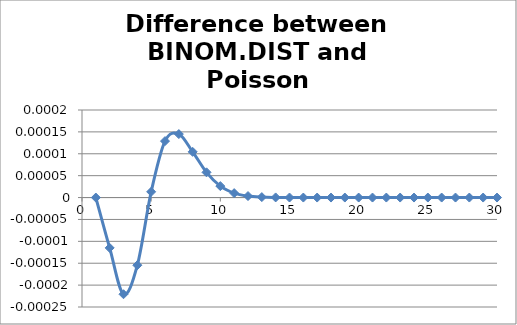
| Category | BINOM.DIST v. Poisson |
|---|---|
| 0 | 0 |
| 1 | 0 |
| 2 | 0 |
| 3 | 0 |
| 4 | 0 |
| 5 | 0 |
| 6 | 0 |
| 7 | 0 |
| 8 | 0 |
| 9 | 0 |
| 10 | 0 |
| 11 | 0 |
| 12 | 0 |
| 13 | 0 |
| 14 | 0 |
| 15 | 0 |
| 16 | 0 |
| 17 | 0 |
| 18 | 0 |
| 19 | 0 |
| 20 | 0 |
| 21 | 0 |
| 22 | 0 |
| 23 | 0 |
| 24 | 0 |
| 25 | 0 |
| 26 | 0 |
| 27 | 0 |
| 28 | 0 |
| 29 | 0 |
| 30 | 0 |
| 31 | 0 |
| 32 | 0 |
| 33 | 0 |
| 34 | 0 |
| 35 | 0 |
| 36 | 0 |
| 37 | 0 |
| 38 | 0 |
| 39 | 0 |
| 40 | 0 |
| 41 | 0 |
| 42 | 0 |
| 43 | 0 |
| 44 | 0 |
| 45 | 0 |
| 46 | 0 |
| 47 | 0 |
| 48 | 0 |
| 49 | 0 |
| 50 | 0 |
| 51 | 0 |
| 52 | 0 |
| 53 | 0 |
| 54 | 0 |
| 55 | 0 |
| 56 | 0 |
| 57 | 0 |
| 58 | 0 |
| 59 | 0 |
| 60 | 0 |
| 61 | 0 |
| 62 | 0 |
| 63 | 0 |
| 64 | 0 |
| 65 | 0 |
| 66 | 0 |
| 67 | 0 |
| 68 | 0 |
| 69 | 0 |
| 70 | 0 |
| 71 | 0 |
| 72 | 0 |
| 73 | 0 |
| 74 | 0 |
| 75 | 0 |
| 76 | 0 |
| 77 | 0 |
| 78 | 0 |
| 79 | 0 |
| 80 | 0 |
| 81 | 0 |
| 82 | 0 |
| 83 | 0 |
| 84 | 0 |
| 85 | 0 |
| 86 | 0 |
| 87 | 0 |
| 88 | 0 |
| 89 | 0 |
| 90 | 0 |
| 91 | 0 |
| 92 | 0 |
| 93 | 0 |
| 94 | 0 |
| 95 | 0 |
| 96 | 0 |
| 97 | 0 |
| 98 | 0 |
| 99 | 0 |
| 100 | 0 |
| 101 | 0 |
| 102 | 0 |
| 103 | 0 |
| 104 | 0 |
| 105 | 0 |
| 106 | 0 |
| 107 | 0 |
| 108 | 0 |
| 109 | 0 |
| 110 | 0 |
| 111 | 0 |
| 112 | 0 |
| 113 | 0 |
| 114 | 0 |
| 115 | 0 |
| 116 | 0 |
| 117 | 0 |
| 118 | 0 |
| 119 | 0 |
| 120 | 0 |
| 121 | 0 |
| 122 | 0 |
| 123 | 0 |
| 124 | 0 |
| 125 | 0 |
| 126 | 0 |
| 127 | 0 |
| 128 | 0 |
| 129 | 0 |
| 130 | 0 |
| 131 | 0 |
| 132 | 0 |
| 133 | 0 |
| 134 | 0 |
| 135 | 0 |
| 136 | 0 |
| 137 | 0 |
| 138 | 0 |
| 139 | 0 |
| 140 | 0 |
| 141 | 0 |
| 142 | 0 |
| 143 | 0 |
| 144 | 0 |
| 145 | 0 |
| 146 | 0 |
| 147 | 0 |
| 148 | 0 |
| 149 | 0 |
| 150 | 0 |
| 151 | 0 |
| 152 | 0 |
| 153 | 0 |
| 154 | 0 |
| 155 | 0 |
| 156 | 0 |
| 157 | 0 |
| 158 | 0 |
| 159 | 0 |
| 160 | 0 |
| 161 | 0 |
| 162 | 0 |
| 163 | 0 |
| 164 | 0 |
| 165 | 0 |
| 166 | 0 |
| 167 | 0 |
| 168 | 0 |
| 169 | 0 |
| 170 | 0 |
| 171 | 0 |
| 172 | 0 |
| 173 | 0 |
| 174 | 0 |
| 175 | 0 |
| 176 | 0 |
| 177 | 0 |
| 178 | 0 |
| 179 | 0 |
| 180 | 0 |
| 181 | 0 |
| 182 | 0 |
| 183 | 0 |
| 184 | 0 |
| 185 | 0 |
| 186 | 0 |
| 187 | 0 |
| 188 | 0 |
| 189 | 0 |
| 190 | 0 |
| 191 | 0 |
| 192 | 0 |
| 193 | 0 |
| 194 | 0 |
| 195 | 0 |
| 196 | 0 |
| 197 | 0 |
| 198 | 0 |
| 199 | 0 |
| 200 | 0 |
| 201 | 0 |
| 202 | 0 |
| 203 | 0 |
| 204 | 0 |
| 205 | 0 |
| 206 | 0 |
| 207 | 0 |
| 208 | 0 |
| 209 | 0 |
| 210 | 0 |
| 211 | 0 |
| 212 | 0 |
| 213 | 0 |
| 214 | 0 |
| 215 | 0 |
| 216 | 0 |
| 217 | 0 |
| 218 | 0 |
| 219 | 0 |
| 220 | 0 |
| 221 | 0 |
| 222 | 0 |
| 223 | 0 |
| 224 | 0 |
| 225 | 0 |
| 226 | 0 |
| 227 | 0 |
| 228 | 0 |
| 229 | 0 |
| 230 | 0 |
| 231 | 0 |
| 232 | 0 |
| 233 | 0 |
| 234 | 0 |
| 235 | 0 |
| 236 | 0 |
| 237 | 0 |
| 238 | 0 |
| 239 | 0 |
| 240 | 0 |
| 241 | 0 |
| 242 | 0 |
| 243 | 0 |
| 244 | 0 |
| 245 | 0 |
| 246 | 0 |
| 247 | 0 |
| 248 | 0 |
| 249 | 0 |
| 250 | 0 |
| 251 | 0 |
| 252 | 0 |
| 253 | 0 |
| 254 | 0 |
| 255 | 0 |
| 256 | 0 |
| 257 | 0 |
| 258 | 0 |
| 259 | 0 |
| 260 | 0 |
| 261 | 0 |
| 262 | 0 |
| 263 | 0 |
| 264 | 0 |
| 265 | 0 |
| 266 | 0 |
| 267 | 0 |
| 268 | 0 |
| 269 | 0 |
| 270 | 0 |
| 271 | 0 |
| 272 | 0 |
| 273 | 0 |
| 274 | 0 |
| 275 | 0 |
| 276 | 0 |
| 277 | 0 |
| 278 | 0 |
| 279 | 0 |
| 280 | 0 |
| 281 | 0 |
| 282 | 0 |
| 283 | 0 |
| 284 | 0 |
| 285 | 0 |
| 286 | 0 |
| 287 | 0 |
| 288 | 0 |
| 289 | 0 |
| 290 | 0 |
| 291 | 0 |
| 292 | 0 |
| 293 | 0 |
| 294 | 0 |
| 295 | 0 |
| 296 | 0 |
| 297 | 0 |
| 298 | 0 |
| 299 | 0 |
| 300 | 0 |
| 301 | 0 |
| 302 | 0 |
| 303 | 0 |
| 304 | 0 |
| 305 | 0 |
| 306 | 0 |
| 307 | 0 |
| 308 | 0 |
| 309 | 0 |
| 310 | 0 |
| 311 | 0 |
| 312 | 0 |
| 313 | 0 |
| 314 | 0 |
| 315 | 0 |
| 316 | 0 |
| 317 | 0 |
| 318 | 0 |
| 319 | 0 |
| 320 | 0 |
| 321 | 0 |
| 322 | 0 |
| 323 | 0 |
| 324 | 0 |
| 325 | 0 |
| 326 | 0 |
| 327 | 0 |
| 328 | 0 |
| 329 | 0 |
| 330 | 0 |
| 331 | 0 |
| 332 | 0 |
| 333 | 0 |
| 334 | 0 |
| 335 | 0 |
| 336 | 0 |
| 337 | 0 |
| 338 | 0 |
| 339 | 0 |
| 340 | 0 |
| 341 | 0 |
| 342 | 0 |
| 343 | 0 |
| 344 | 0 |
| 345 | 0 |
| 346 | 0 |
| 347 | 0 |
| 348 | 0 |
| 349 | 0 |
| 350 | 0 |
| 351 | 0 |
| 352 | 0 |
| 353 | 0 |
| 354 | 0 |
| 355 | 0 |
| 356 | 0 |
| 357 | 0 |
| 358 | 0 |
| 359 | 0 |
| 360 | 0 |
| 361 | 0 |
| 362 | 0 |
| 363 | 0 |
| 364 | 0 |
| 365 | 0 |
| 366 | 0 |
| 367 | 0 |
| 368 | 0 |
| 369 | 0 |
| 370 | 0 |
| 371 | 0 |
| 372 | 0 |
| 373 | 0 |
| 374 | 0 |
| 375 | 0 |
| 376 | 0 |
| 377 | 0 |
| 378 | 0 |
| 379 | 0 |
| 380 | 0 |
| 381 | 0 |
| 382 | 0 |
| 383 | 0 |
| 384 | 0 |
| 385 | 0 |
| 386 | 0 |
| 387 | 0 |
| 388 | 0 |
| 389 | 0 |
| 390 | 0 |
| 391 | 0 |
| 392 | 0 |
| 393 | 0 |
| 394 | 0 |
| 395 | 0 |
| 396 | 0 |
| 397 | 0 |
| 398 | 0 |
| 399 | 0 |
| 400 | 0 |
| 401 | 0 |
| 402 | 0 |
| 403 | 0 |
| 404 | 0 |
| 405 | 0 |
| 406 | 0 |
| 407 | 0 |
| 408 | 0 |
| 409 | 0 |
| 410 | 0 |
| 411 | 0 |
| 412 | 0 |
| 413 | 0 |
| 414 | 0 |
| 415 | 0 |
| 416 | 0 |
| 417 | 0 |
| 418 | 0 |
| 419 | 0 |
| 420 | 0 |
| 421 | 0 |
| 422 | 0 |
| 423 | 0 |
| 424 | 0 |
| 425 | 0 |
| 426 | 0 |
| 427 | 0 |
| 428 | 0 |
| 429 | 0 |
| 430 | 0 |
| 431 | 0 |
| 432 | 0 |
| 433 | 0 |
| 434 | 0 |
| 435 | 0 |
| 436 | 0 |
| 437 | 0 |
| 438 | 0 |
| 439 | 0 |
| 440 | 0 |
| 441 | 0 |
| 442 | 0 |
| 443 | 0 |
| 444 | 0 |
| 445 | 0 |
| 446 | 0 |
| 447 | 0 |
| 448 | 0 |
| 449 | 0 |
| 450 | 0 |
| 451 | 0 |
| 452 | 0 |
| 453 | 0 |
| 454 | 0 |
| 455 | 0 |
| 456 | 0 |
| 457 | 0 |
| 458 | 0 |
| 459 | 0 |
| 460 | 0 |
| 461 | 0 |
| 462 | 0 |
| 463 | 0 |
| 464 | 0 |
| 465 | 0 |
| 466 | 0 |
| 467 | 0 |
| 468 | 0 |
| 469 | 0 |
| 470 | 0 |
| 471 | 0 |
| 472 | 0 |
| 473 | 0 |
| 474 | 0 |
| 475 | 0 |
| 476 | 0 |
| 477 | 0 |
| 478 | 0 |
| 479 | 0 |
| 480 | 0 |
| 481 | 0 |
| 482 | 0 |
| 483 | 0 |
| 484 | 0 |
| 485 | 0 |
| 486 | 0 |
| 487 | 0 |
| 488 | 0 |
| 489 | 0 |
| 490 | 0 |
| 491 | 0 |
| 492 | 0 |
| 493 | 0 |
| 494 | 0 |
| 495 | 0 |
| 496 | 0 |
| 497 | 0 |
| 498 | 0 |
| 499 | 0 |
| 500 | 0 |
| 501 | 0 |
| 502 | 0 |
| 503 | 0 |
| 504 | 0 |
| 505 | 0 |
| 506 | 0 |
| 507 | 0 |
| 508 | 0 |
| 509 | 0 |
| 510 | 0 |
| 511 | 0 |
| 512 | 0 |
| 513 | 0 |
| 514 | 0 |
| 515 | 0 |
| 516 | 0 |
| 517 | 0 |
| 518 | 0 |
| 519 | 0 |
| 520 | 0 |
| 521 | 0 |
| 522 | 0 |
| 523 | 0 |
| 524 | 0 |
| 525 | 0 |
| 526 | 0 |
| 527 | 0 |
| 528 | 0 |
| 529 | 0 |
| 530 | 0 |
| 531 | 0 |
| 532 | 0 |
| 533 | 0 |
| 534 | 0 |
| 535 | 0 |
| 536 | 0 |
| 537 | 0 |
| 538 | 0 |
| 539 | 0 |
| 540 | 0 |
| 541 | 0 |
| 542 | 0 |
| 543 | 0 |
| 544 | 0 |
| 545 | 0 |
| 546 | 0 |
| 547 | 0 |
| 548 | 0 |
| 549 | 0 |
| 550 | 0 |
| 551 | 0 |
| 552 | 0 |
| 553 | 0 |
| 554 | 0 |
| 555 | 0 |
| 556 | 0 |
| 557 | 0 |
| 558 | 0 |
| 559 | 0 |
| 560 | 0 |
| 561 | 0 |
| 562 | 0 |
| 563 | 0 |
| 564 | 0 |
| 565 | 0 |
| 566 | 0 |
| 567 | 0 |
| 568 | 0 |
| 569 | 0 |
| 570 | 0 |
| 571 | 0 |
| 572 | 0 |
| 573 | 0 |
| 574 | 0 |
| 575 | 0 |
| 576 | 0 |
| 577 | 0 |
| 578 | 0 |
| 579 | 0 |
| 580 | 0 |
| 581 | 0 |
| 582 | 0 |
| 583 | 0 |
| 584 | 0 |
| 585 | 0 |
| 586 | 0 |
| 587 | 0 |
| 588 | 0 |
| 589 | 0 |
| 590 | 0 |
| 591 | 0 |
| 592 | 0 |
| 593 | 0 |
| 594 | 0 |
| 595 | 0 |
| 596 | 0 |
| 597 | 0 |
| 598 | 0 |
| 599 | 0 |
| 600 | 0 |
| 601 | 0 |
| 602 | 0 |
| 603 | 0 |
| 604 | 0 |
| 605 | 0 |
| 606 | 0 |
| 607 | 0 |
| 608 | 0 |
| 609 | 0 |
| 610 | 0 |
| 611 | 0 |
| 612 | 0 |
| 613 | 0 |
| 614 | 0 |
| 615 | 0 |
| 616 | 0 |
| 617 | 0 |
| 618 | 0 |
| 619 | 0 |
| 620 | 0 |
| 621 | 0 |
| 622 | 0 |
| 623 | 0 |
| 624 | 0 |
| 625 | 0 |
| 626 | 0 |
| 627 | 0 |
| 628 | 0 |
| 629 | 0 |
| 630 | 0 |
| 631 | 0 |
| 632 | 0 |
| 633 | 0 |
| 634 | 0 |
| 635 | 0 |
| 636 | 0 |
| 637 | 0 |
| 638 | 0 |
| 639 | 0 |
| 640 | 0 |
| 641 | 0 |
| 642 | 0 |
| 643 | 0 |
| 644 | 0 |
| 645 | 0 |
| 646 | 0 |
| 647 | 0 |
| 648 | 0 |
| 649 | 0 |
| 650 | 0 |
| 651 | 0 |
| 652 | 0 |
| 653 | 0 |
| 654 | 0 |
| 655 | 0 |
| 656 | 0 |
| 657 | 0 |
| 658 | 0 |
| 659 | 0 |
| 660 | 0 |
| 661 | 0 |
| 662 | 0 |
| 663 | 0 |
| 664 | 0 |
| 665 | 0 |
| 666 | 0 |
| 667 | 0 |
| 668 | 0 |
| 669 | 0 |
| 670 | 0 |
| 671 | 0 |
| 672 | 0 |
| 673 | 0 |
| 674 | 0 |
| 675 | 0 |
| 676 | 0 |
| 677 | 0 |
| 678 | 0 |
| 679 | 0 |
| 680 | 0 |
| 681 | 0 |
| 682 | 0 |
| 683 | 0 |
| 684 | 0 |
| 685 | 0 |
| 686 | 0 |
| 687 | 0 |
| 688 | 0 |
| 689 | 0 |
| 690 | 0 |
| 691 | 0 |
| 692 | 0 |
| 693 | 0 |
| 694 | 0 |
| 695 | 0 |
| 696 | 0 |
| 697 | 0 |
| 698 | 0 |
| 699 | 0 |
| 700 | 0 |
| 701 | 0 |
| 702 | 0 |
| 703 | 0 |
| 704 | 0 |
| 705 | 0 |
| 706 | 0 |
| 707 | 0 |
| 708 | 0 |
| 709 | 0 |
| 710 | 0 |
| 711 | 0 |
| 712 | 0 |
| 713 | 0 |
| 714 | 0 |
| 715 | 0 |
| 716 | 0 |
| 717 | 0 |
| 718 | 0 |
| 719 | 0 |
| 720 | 0 |
| 721 | 0 |
| 722 | 0 |
| 723 | 0 |
| 724 | 0 |
| 725 | 0 |
| 726 | 0 |
| 727 | 0 |
| 728 | 0 |
| 729 | 0 |
| 730 | 0 |
| 731 | 0 |
| 732 | 0 |
| 733 | 0 |
| 734 | 0 |
| 735 | 0 |
| 736 | 0 |
| 737 | 0 |
| 738 | 0 |
| 739 | 0 |
| 740 | 0 |
| 741 | 0 |
| 742 | 0 |
| 743 | 0 |
| 744 | 0 |
| 745 | 0 |
| 746 | 0 |
| 747 | 0 |
| 748 | 0 |
| 749 | 0 |
| 750 | 0 |
| 751 | 0 |
| 752 | 0 |
| 753 | 0 |
| 754 | 0 |
| 755 | 0 |
| 756 | 0 |
| 757 | 0 |
| 758 | 0 |
| 759 | 0 |
| 760 | 0 |
| 761 | 0 |
| 762 | 0 |
| 763 | 0 |
| 764 | 0 |
| 765 | 0 |
| 766 | 0 |
| 767 | 0 |
| 768 | 0 |
| 769 | 0 |
| 770 | 0 |
| 771 | 0 |
| 772 | 0 |
| 773 | 0 |
| 774 | 0 |
| 775 | 0 |
| 776 | 0 |
| 777 | 0 |
| 778 | 0 |
| 779 | 0 |
| 780 | 0 |
| 781 | 0 |
| 782 | 0 |
| 783 | 0 |
| 784 | 0 |
| 785 | 0 |
| 786 | 0 |
| 787 | 0 |
| 788 | 0 |
| 789 | 0 |
| 790 | 0 |
| 791 | 0 |
| 792 | 0 |
| 793 | 0 |
| 794 | 0 |
| 795 | 0 |
| 796 | 0 |
| 797 | 0 |
| 798 | 0 |
| 799 | 0 |
| 800 | 0 |
| 801 | 0 |
| 802 | 0 |
| 803 | 0 |
| 804 | 0 |
| 805 | 0 |
| 806 | 0 |
| 807 | 0 |
| 808 | 0 |
| 809 | 0 |
| 810 | 0 |
| 811 | 0 |
| 812 | 0 |
| 813 | 0 |
| 814 | 0 |
| 815 | 0 |
| 816 | 0 |
| 817 | 0 |
| 818 | 0 |
| 819 | 0 |
| 820 | 0 |
| 821 | 0 |
| 822 | 0 |
| 823 | 0 |
| 824 | 0 |
| 825 | 0 |
| 826 | 0 |
| 827 | 0 |
| 828 | 0 |
| 829 | 0 |
| 830 | 0 |
| 831 | 0 |
| 832 | 0 |
| 833 | 0 |
| 834 | 0 |
| 835 | 0 |
| 836 | 0 |
| 837 | 0 |
| 838 | 0 |
| 839 | 0 |
| 840 | 0 |
| 841 | 0 |
| 842 | 0 |
| 843 | 0 |
| 844 | 0 |
| 845 | 0 |
| 846 | 0 |
| 847 | 0 |
| 848 | 0 |
| 849 | 0 |
| 850 | 0 |
| 851 | 0 |
| 852 | 0 |
| 853 | 0 |
| 854 | 0 |
| 855 | 0 |
| 856 | 0 |
| 857 | 0 |
| 858 | 0 |
| 859 | 0 |
| 860 | 0 |
| 861 | 0 |
| 862 | 0 |
| 863 | 0 |
| 864 | 0 |
| 865 | 0 |
| 866 | 0 |
| 867 | 0 |
| 868 | 0 |
| 869 | 0 |
| 870 | 0 |
| 871 | 0 |
| 872 | 0 |
| 873 | 0 |
| 874 | 0 |
| 875 | 0 |
| 876 | 0 |
| 877 | 0 |
| 878 | 0 |
| 879 | 0 |
| 880 | 0 |
| 881 | 0 |
| 882 | 0 |
| 883 | 0 |
| 884 | 0 |
| 885 | 0 |
| 886 | 0 |
| 887 | 0 |
| 888 | 0 |
| 889 | 0 |
| 890 | 0 |
| 891 | 0 |
| 892 | 0 |
| 893 | 0 |
| 894 | 0 |
| 895 | 0 |
| 896 | 0 |
| 897 | 0 |
| 898 | 0 |
| 899 | 0 |
| 900 | 0 |
| 901 | 0 |
| 902 | 0 |
| 903 | 0 |
| 904 | 0 |
| 905 | 0 |
| 906 | 0 |
| 907 | 0 |
| 908 | 0 |
| 909 | 0 |
| 910 | 0 |
| 911 | 0 |
| 912 | 0 |
| 913 | 0 |
| 914 | 0 |
| 915 | 0 |
| 916 | 0 |
| 917 | 0 |
| 918 | 0 |
| 919 | 0 |
| 920 | 0 |
| 921 | 0 |
| 922 | 0 |
| 923 | 0 |
| 924 | 0 |
| 925 | 0 |
| 926 | 0 |
| 927 | 0 |
| 928 | 0 |
| 929 | 0 |
| 930 | 0 |
| 931 | 0 |
| 932 | 0 |
| 933 | 0 |
| 934 | 0 |
| 935 | 0 |
| 936 | 0 |
| 937 | 0 |
| 938 | 0 |
| 939 | 0 |
| 940 | 0 |
| 941 | 0 |
| 942 | 0 |
| 943 | 0 |
| 944 | 0 |
| 945 | 0 |
| 946 | 0 |
| 947 | 0 |
| 948 | 0 |
| 949 | 0 |
| 950 | 0 |
| 951 | 0 |
| 952 | 0 |
| 953 | 0 |
| 954 | 0 |
| 955 | 0 |
| 956 | 0 |
| 957 | 0 |
| 958 | 0 |
| 959 | 0 |
| 960 | 0 |
| 961 | 0 |
| 962 | 0 |
| 963 | 0 |
| 964 | 0 |
| 965 | 0 |
| 966 | 0 |
| 967 | 0 |
| 968 | 0 |
| 969 | 0 |
| 970 | 0 |
| 971 | 0 |
| 972 | 0 |
| 973 | 0 |
| 974 | 0 |
| 975 | 0 |
| 976 | 0 |
| 977 | 0 |
| 978 | 0 |
| 979 | 0 |
| 980 | 0 |
| 981 | 0 |
| 982 | 0 |
| 983 | 0 |
| 984 | 0 |
| 985 | 0 |
| 986 | 0 |
| 987 | 0 |
| 988 | 0 |
| 989 | 0 |
| 990 | 0 |
| 991 | 0 |
| 992 | 0 |
| 993 | 0 |
| 994 | 0 |
| 995 | 0 |
| 996 | 0 |
| 997 | 0 |
| 998 | 0 |
| 999 | 0 |
| 1000 | 0 |
| 1001 | 0 |
| 1002 | 0 |
| 1003 | 0 |
| 1004 | 0 |
| 1005 | 0 |
| 1006 | 0 |
| 1007 | 0 |
| 1008 | 0 |
| 1009 | 0 |
| 1010 | 0 |
| 1011 | 0 |
| 1012 | 0 |
| 1013 | 0 |
| 1014 | 0 |
| 1015 | 0 |
| 1016 | 0 |
| 1017 | 0 |
| 1018 | 0 |
| 1019 | 0 |
| 1020 | 0 |
| 1021 | 0 |
| 1022 | 0 |
| 1023 | 0 |
| 1024 | 0 |
| 1025 | 0 |
| 1026 | 0 |
| 1027 | 0 |
| 1028 | 0 |
| 1029 | 0 |
| 1030 | 0 |
| 1031 | 0 |
| 1032 | 0 |
| 1033 | 0 |
| 1034 | 0 |
| 1035 | 0 |
| 1036 | 0 |
| 1037 | 0 |
| 1038 | 0 |
| 1039 | 0 |
| 1040 | 0 |
| 1041 | 0 |
| 1042 | 0 |
| 1043 | 0 |
| 1044 | 0 |
| 1045 | 0 |
| 1046 | 0 |
| 1047 | 0 |
| 1048 | 0 |
| 1049 | 0 |
| 1050 | 0 |
| 1051 | 0 |
| 1052 | 0 |
| 1053 | 0 |
| 1054 | 0 |
| 1055 | 0 |
| 1056 | 0 |
| 1057 | 0 |
| 1058 | 0 |
| 1059 | 0 |
| 1060 | 0 |
| 1061 | 0 |
| 1062 | 0 |
| 1063 | 0 |
| 1064 | 0 |
| 1065 | 0 |
| 1066 | 0 |
| 1067 | 0 |
| 1068 | 0 |
| 1069 | 0 |
| 1070 | 0 |
| 1071 | 0 |
| 1072 | 0 |
| 1073 | 0 |
| 1074 | 0 |
| 1075 | 0 |
| 1076 | 0 |
| 1077 | 0 |
| 1078 | 0 |
| 1079 | 0 |
| 1080 | 0 |
| 1081 | 0 |
| 1082 | 0 |
| 1083 | 0 |
| 1084 | 0 |
| 1085 | 0 |
| 1086 | 0 |
| 1087 | 0 |
| 1088 | 0 |
| 1089 | 0 |
| 1090 | 0 |
| 1091 | 0 |
| 1092 | 0 |
| 1093 | 0 |
| 1094 | 0 |
| 1095 | 0 |
| 1096 | 0 |
| 1097 | 0 |
| 1098 | 0 |
| 1099 | 0 |
| 1100 | 0 |
| 1101 | 0 |
| 1102 | 0 |
| 1103 | 0 |
| 1104 | 0 |
| 1105 | 0 |
| 1106 | 0 |
| 1107 | 0 |
| 1108 | 0 |
| 1109 | 0 |
| 1110 | 0 |
| 1111 | 0 |
| 1112 | 0 |
| 1113 | 0 |
| 1114 | 0 |
| 1115 | 0 |
| 1116 | 0 |
| 1117 | 0 |
| 1118 | 0 |
| 1119 | 0 |
| 1120 | 0 |
| 1121 | 0 |
| 1122 | 0 |
| 1123 | 0 |
| 1124 | 0 |
| 1125 | 0 |
| 1126 | 0 |
| 1127 | 0 |
| 1128 | 0 |
| 1129 | 0 |
| 1130 | 0 |
| 1131 | 0 |
| 1132 | 0 |
| 1133 | 0 |
| 1134 | 0 |
| 1135 | 0 |
| 1136 | 0 |
| 1137 | 0 |
| 1138 | 0 |
| 1139 | 0 |
| 1140 | 0 |
| 1141 | 0 |
| 1142 | 0 |
| 1143 | 0 |
| 1144 | 0 |
| 1145 | 0 |
| 1146 | 0 |
| 1147 | 0 |
| 1148 | 0 |
| 1149 | 0 |
| 1150 | 0 |
| 1151 | 0 |
| 1152 | 0 |
| 1153 | 0 |
| 1154 | 0 |
| 1155 | 0 |
| 1156 | 0 |
| 1157 | 0 |
| 1158 | 0 |
| 1159 | 0 |
| 1160 | 0 |
| 1161 | 0 |
| 1162 | 0 |
| 1163 | 0 |
| 1164 | 0 |
| 1165 | 0 |
| 1166 | 0 |
| 1167 | 0 |
| 1168 | 0 |
| 1169 | 0 |
| 1170 | 0 |
| 1171 | 0 |
| 1172 | 0 |
| 1173 | 0 |
| 1174 | 0 |
| 1175 | 0 |
| 1176 | 0 |
| 1177 | 0 |
| 1178 | 0 |
| 1179 | 0 |
| 1180 | 0 |
| 1181 | 0 |
| 1182 | 0 |
| 1183 | 0 |
| 1184 | 0 |
| 1185 | 0 |
| 1186 | 0 |
| 1187 | 0 |
| 1188 | 0 |
| 1189 | 0 |
| 1190 | 0 |
| 1191 | 0 |
| 1192 | 0 |
| 1193 | 0 |
| 1194 | 0 |
| 1195 | 0 |
| 1196 | 0 |
| 1197 | 0 |
| 1198 | 0 |
| 1199 | 0 |
| 1200 | 0 |
| 1201 | 0 |
| 1202 | 0 |
| 1203 | 0 |
| 1204 | 0 |
| 1205 | 0 |
| 1206 | 0 |
| 1207 | 0 |
| 1208 | 0 |
| 1209 | 0 |
| 1210 | 0 |
| 1211 | 0 |
| 1212 | 0 |
| 1213 | 0 |
| 1214 | 0 |
| 1215 | 0 |
| 1216 | 0 |
| 1217 | 0 |
| 1218 | 0 |
| 1219 | 0 |
| 1220 | 0 |
| 1221 | 0 |
| 1222 | 0 |
| 1223 | 0 |
| 1224 | 0 |
| 1225 | 0 |
| 1226 | 0 |
| 1227 | 0 |
| 1228 | 0 |
| 1229 | 0 |
| 1230 | 0 |
| 1231 | 0 |
| 1232 | 0 |
| 1233 | 0 |
| 1234 | 0 |
| 1235 | 0 |
| 1236 | 0 |
| 1237 | 0 |
| 1238 | 0 |
| 1239 | 0 |
| 1240 | 0 |
| 1241 | 0 |
| 1242 | 0 |
| 1243 | 0 |
| 1244 | 0 |
| 1245 | 0 |
| 1246 | 0 |
| 1247 | 0 |
| 1248 | 0 |
| 1249 | 0 |
| 1250 | 0 |
| 1251 | 0 |
| 1252 | 0 |
| 1253 | 0 |
| 1254 | 0 |
| 1255 | 0 |
| 1256 | 0 |
| 1257 | 0 |
| 1258 | 0 |
| 1259 | 0 |
| 1260 | 0 |
| 1261 | 0 |
| 1262 | 0 |
| 1263 | 0 |
| 1264 | 0 |
| 1265 | 0 |
| 1266 | 0 |
| 1267 | 0 |
| 1268 | 0 |
| 1269 | 0 |
| 1270 | 0 |
| 1271 | 0 |
| 1272 | 0 |
| 1273 | 0 |
| 1274 | 0 |
| 1275 | 0 |
| 1276 | 0 |
| 1277 | 0 |
| 1278 | 0 |
| 1279 | 0 |
| 1280 | 0 |
| 1281 | 0 |
| 1282 | 0 |
| 1283 | 0 |
| 1284 | 0 |
| 1285 | 0 |
| 1286 | 0 |
| 1287 | 0 |
| 1288 | 0 |
| 1289 | 0 |
| 1290 | 0 |
| 1291 | 0 |
| 1292 | 0 |
| 1293 | 0 |
| 1294 | 0 |
| 1295 | 0 |
| 1296 | 0 |
| 1297 | 0 |
| 1298 | 0 |
| 1299 | 0 |
| 1300 | 0 |
| 1301 | 0 |
| 1302 | 0 |
| 1303 | 0 |
| 1304 | 0 |
| 1305 | 0 |
| 1306 | 0 |
| 1307 | 0 |
| 1308 | 0 |
| 1309 | 0 |
| 1310 | 0 |
| 1311 | 0 |
| 1312 | 0 |
| 1313 | 0 |
| 1314 | 0 |
| 1315 | 0 |
| 1316 | 0 |
| 1317 | 0 |
| 1318 | 0 |
| 1319 | 0 |
| 1320 | 0 |
| 1321 | 0 |
| 1322 | 0 |
| 1323 | 0 |
| 1324 | 0 |
| 1325 | 0 |
| 1326 | 0 |
| 1327 | 0 |
| 1328 | 0 |
| 1329 | 0 |
| 1330 | 0 |
| 1331 | 0 |
| 1332 | 0 |
| 1333 | 0 |
| 1334 | 0 |
| 1335 | 0 |
| 1336 | 0 |
| 1337 | 0 |
| 1338 | 0 |
| 1339 | 0 |
| 1340 | 0 |
| 1341 | 0 |
| 1342 | 0 |
| 1343 | 0 |
| 1344 | 0 |
| 1345 | 0 |
| 1346 | 0 |
| 1347 | 0 |
| 1348 | 0 |
| 1349 | 0 |
| 1350 | 0 |
| 1351 | 0 |
| 1352 | 0 |
| 1353 | 0 |
| 1354 | 0 |
| 1355 | 0 |
| 1356 | 0 |
| 1357 | 0 |
| 1358 | 0 |
| 1359 | 0 |
| 1360 | 0 |
| 1361 | 0 |
| 1362 | 0 |
| 1363 | 0 |
| 1364 | 0 |
| 1365 | 0 |
| 1366 | 0 |
| 1367 | 0 |
| 1368 | 0 |
| 1369 | 0 |
| 1370 | 0 |
| 1371 | 0 |
| 1372 | 0 |
| 1373 | 0 |
| 1374 | 0 |
| 1375 | 0 |
| 1376 | 0 |
| 1377 | 0 |
| 1378 | 0 |
| 1379 | 0 |
| 1380 | 0 |
| 1381 | 0 |
| 1382 | 0 |
| 1383 | 0 |
| 1384 | 0 |
| 1385 | 0 |
| 1386 | 0 |
| 1387 | 0 |
| 1388 | 0 |
| 1389 | 0 |
| 1390 | 0 |
| 1391 | 0 |
| 1392 | 0 |
| 1393 | 0 |
| 1394 | 0 |
| 1395 | 0 |
| 1396 | 0 |
| 1397 | 0 |
| 1398 | 0 |
| 1399 | 0 |
| 1400 | 0 |
| 1401 | 0 |
| 1402 | 0 |
| 1403 | 0 |
| 1404 | 0 |
| 1405 | 0 |
| 1406 | 0 |
| 1407 | 0 |
| 1408 | 0 |
| 1409 | 0 |
| 1410 | 0 |
| 1411 | 0 |
| 1412 | 0 |
| 1413 | 0 |
| 1414 | 0 |
| 1415 | 0 |
| 1416 | 0 |
| 1417 | 0 |
| 1418 | 0 |
| 1419 | 0 |
| 1420 | 0 |
| 1421 | 0 |
| 1422 | 0 |
| 1423 | 0 |
| 1424 | 0 |
| 1425 | 0 |
| 1426 | 0 |
| 1427 | 0 |
| 1428 | 0 |
| 1429 | 0 |
| 1430 | 0 |
| 1431 | 0 |
| 1432 | 0 |
| 1433 | 0 |
| 1434 | 0 |
| 1435 | 0 |
| 1436 | 0 |
| 1437 | 0 |
| 1438 | 0 |
| 1439 | 0 |
| 1440 | 0 |
| 1441 | 0 |
| 1442 | 0 |
| 1443 | 0 |
| 1444 | 0 |
| 1445 | 0 |
| 1446 | 0 |
| 1447 | 0 |
| 1448 | 0 |
| 1449 | 0 |
| 1450 | 0 |
| 1451 | 0 |
| 1452 | 0 |
| 1453 | 0 |
| 1454 | 0 |
| 1455 | 0 |
| 1456 | 0 |
| 1457 | 0 |
| 1458 | 0 |
| 1459 | 0 |
| 1460 | 0 |
| 1461 | 0 |
| 1462 | 0 |
| 1463 | 0 |
| 1464 | 0 |
| 1465 | 0 |
| 1466 | 0 |
| 1467 | 0 |
| 1468 | 0 |
| 1469 | 0 |
| 1470 | 0 |
| 1471 | 0 |
| 1472 | 0 |
| 1473 | 0 |
| 1474 | 0 |
| 1475 | 0 |
| 1476 | 0 |
| 1477 | 0 |
| 1478 | 0 |
| 1479 | 0 |
| 1480 | 0 |
| 1481 | 0 |
| 1482 | 0 |
| 1483 | 0 |
| 1484 | 0 |
| 1485 | 0 |
| 1486 | 0 |
| 1487 | 0 |
| 1488 | 0 |
| 1489 | 0 |
| 1490 | 0 |
| 1491 | 0 |
| 1492 | 0 |
| 1493 | 0 |
| 1494 | 0 |
| 1495 | 0 |
| 1496 | 0 |
| 1497 | 0 |
| 1498 | 0 |
| 1499 | 0 |
| 1500 | 0 |
| 1501 | 0 |
| 1502 | 0 |
| 1503 | 0 |
| 1504 | 0 |
| 1505 | 0 |
| 1506 | 0 |
| 1507 | 0 |
| 1508 | 0 |
| 1509 | 0 |
| 1510 | 0 |
| 1511 | 0 |
| 1512 | 0 |
| 1513 | 0 |
| 1514 | 0 |
| 1515 | 0 |
| 1516 | 0 |
| 1517 | 0 |
| 1518 | 0 |
| 1519 | 0 |
| 1520 | 0 |
| 1521 | 0 |
| 1522 | 0 |
| 1523 | 0 |
| 1524 | 0 |
| 1525 | 0 |
| 1526 | 0 |
| 1527 | 0 |
| 1528 | 0 |
| 1529 | 0 |
| 1530 | 0 |
| 1531 | 0 |
| 1532 | 0 |
| 1533 | 0 |
| 1534 | 0 |
| 1535 | 0 |
| 1536 | 0 |
| 1537 | 0 |
| 1538 | 0 |
| 1539 | 0 |
| 1540 | 0 |
| 1541 | 0 |
| 1542 | 0 |
| 1543 | 0 |
| 1544 | 0 |
| 1545 | 0 |
| 1546 | 0 |
| 1547 | 0 |
| 1548 | 0 |
| 1549 | 0 |
| 1550 | 0 |
| 1551 | 0 |
| 1552 | 0 |
| 1553 | 0 |
| 1554 | 0 |
| 1555 | 0 |
| 1556 | 0 |
| 1557 | 0 |
| 1558 | 0 |
| 1559 | 0 |
| 1560 | 0 |
| 1561 | 0 |
| 1562 | 0 |
| 1563 | 0 |
| 1564 | 0 |
| 1565 | 0 |
| 1566 | 0 |
| 1567 | 0 |
| 1568 | 0 |
| 1569 | 0 |
| 1570 | 0 |
| 1571 | 0 |
| 1572 | 0 |
| 1573 | 0 |
| 1574 | 0 |
| 1575 | 0 |
| 1576 | 0 |
| 1577 | 0 |
| 1578 | 0 |
| 1579 | 0 |
| 1580 | 0 |
| 1581 | 0 |
| 1582 | 0 |
| 1583 | 0 |
| 1584 | 0 |
| 1585 | 0 |
| 1586 | 0 |
| 1587 | 0 |
| 1588 | 0 |
| 1589 | 0 |
| 1590 | 0 |
| 1591 | 0 |
| 1592 | 0 |
| 1593 | 0 |
| 1594 | 0 |
| 1595 | 0 |
| 1596 | 0 |
| 1597 | 0 |
| 1598 | 0 |
| 1599 | 0 |
| 1600 | 0 |
| 1601 | 0 |
| 1602 | 0 |
| 1603 | 0 |
| 1604 | 0 |
| 1605 | 0 |
| 1606 | 0 |
| 1607 | 0 |
| 1608 | 0 |
| 1609 | 0 |
| 1610 | 0 |
| 1611 | 0 |
| 1612 | 0 |
| 1613 | 0 |
| 1614 | 0 |
| 1615 | 0 |
| 1616 | 0 |
| 1617 | 0 |
| 1618 | 0 |
| 1619 | 0 |
| 1620 | 0 |
| 1621 | 0 |
| 1622 | 0 |
| 1623 | 0 |
| 1624 | 0 |
| 1625 | 0 |
| 1626 | 0 |
| 1627 | 0 |
| 1628 | 0 |
| 1629 | 0 |
| 1630 | 0 |
| 1631 | 0 |
| 1632 | 0 |
| 1633 | 0 |
| 1634 | 0 |
| 1635 | 0 |
| 1636 | 0 |
| 1637 | 0 |
| 1638 | 0 |
| 1639 | 0 |
| 1640 | 0 |
| 1641 | 0 |
| 1642 | 0 |
| 1643 | 0 |
| 1644 | 0 |
| 1645 | 0 |
| 1646 | 0 |
| 1647 | 0 |
| 1648 | 0 |
| 1649 | 0 |
| 1650 | 0 |
| 1651 | 0 |
| 1652 | 0 |
| 1653 | 0 |
| 1654 | 0 |
| 1655 | 0 |
| 1656 | 0 |
| 1657 | 0 |
| 1658 | 0 |
| 1659 | 0 |
| 1660 | 0 |
| 1661 | 0 |
| 1662 | 0 |
| 1663 | 0 |
| 1664 | 0 |
| 1665 | 0 |
| 1666 | 0 |
| 1667 | 0 |
| 1668 | 0 |
| 1669 | 0 |
| 1670 | 0 |
| 1671 | 0 |
| 1672 | 0 |
| 1673 | 0 |
| 1674 | 0 |
| 1675 | 0 |
| 1676 | 0 |
| 1677 | 0 |
| 1678 | 0 |
| 1679 | 0 |
| 1680 | 0 |
| 1681 | 0 |
| 1682 | 0 |
| 1683 | 0 |
| 1684 | 0 |
| 1685 | 0 |
| 1686 | 0 |
| 1687 | 0 |
| 1688 | 0 |
| 1689 | 0 |
| 1690 | 0 |
| 1691 | 0 |
| 1692 | 0 |
| 1693 | 0 |
| 1694 | 0 |
| 1695 | 0 |
| 1696 | 0 |
| 1697 | 0 |
| 1698 | 0 |
| 1699 | 0 |
| 1700 | 0 |
| 1701 | 0 |
| 1702 | 0 |
| 1703 | 0 |
| 1704 | 0 |
| 1705 | 0 |
| 1706 | 0 |
| 1707 | 0 |
| 1708 | 0 |
| 1709 | 0 |
| 1710 | 0 |
| 1711 | 0 |
| 1712 | 0 |
| 1713 | 0 |
| 1714 | 0 |
| 1715 | 0 |
| 1716 | 0 |
| 1717 | 0 |
| 1718 | 0 |
| 1719 | 0 |
| 1720 | 0 |
| 1721 | 0 |
| 1722 | 0 |
| 1723 | 0 |
| 1724 | 0 |
| 1725 | 0 |
| 1726 | 0 |
| 1727 | 0 |
| 1728 | 0 |
| 1729 | 0 |
| 1730 | 0 |
| 1731 | 0 |
| 1732 | 0 |
| 1733 | 0 |
| 1734 | 0 |
| 1735 | 0 |
| 1736 | 0 |
| 1737 | 0 |
| 1738 | 0 |
| 1739 | 0 |
| 1740 | 0 |
| 1741 | 0 |
| 1742 | 0 |
| 1743 | 0 |
| 1744 | 0 |
| 1745 | 0 |
| 1746 | 0 |
| 1747 | 0 |
| 1748 | 0 |
| 1749 | 0 |
| 1750 | 0 |
| 1751 | 0 |
| 1752 | 0 |
| 1753 | 0 |
| 1754 | 0 |
| 1755 | 0 |
| 1756 | 0 |
| 1757 | 0 |
| 1758 | 0 |
| 1759 | 0 |
| 1760 | 0 |
| 1761 | 0 |
| 1762 | 0 |
| 1763 | 0 |
| 1764 | 0 |
| 1765 | 0 |
| 1766 | 0 |
| 1767 | 0 |
| 1768 | 0 |
| 1769 | 0 |
| 1770 | 0 |
| 1771 | 0 |
| 1772 | 0 |
| 1773 | 0 |
| 1774 | 0 |
| 1775 | 0 |
| 1776 | 0 |
| 1777 | 0 |
| 1778 | 0 |
| 1779 | 0 |
| 1780 | 0 |
| 1781 | 0 |
| 1782 | 0 |
| 1783 | 0 |
| 1784 | 0 |
| 1785 | 0 |
| 1786 | 0 |
| 1787 | 0 |
| 1788 | 0 |
| 1789 | 0 |
| 1790 | 0 |
| 1791 | 0 |
| 1792 | 0 |
| 1793 | 0 |
| 1794 | 0 |
| 1795 | 0 |
| 1796 | 0 |
| 1797 | 0 |
| 1798 | 0 |
| 1799 | 0 |
| 1800 | 0 |
| 1801 | 0 |
| 1802 | 0 |
| 1803 | 0 |
| 1804 | 0 |
| 1805 | 0 |
| 1806 | 0 |
| 1807 | 0 |
| 1808 | 0 |
| 1809 | 0 |
| 1810 | 0 |
| 1811 | 0 |
| 1812 | 0 |
| 1813 | 0 |
| 1814 | 0 |
| 1815 | 0 |
| 1816 | 0 |
| 1817 | 0 |
| 1818 | 0 |
| 1819 | 0 |
| 1820 | 0 |
| 1821 | 0 |
| 1822 | 0 |
| 1823 | 0 |
| 1824 | 0 |
| 1825 | 0 |
| 1826 | 0 |
| 1827 | 0 |
| 1828 | 0 |
| 1829 | 0 |
| 1830 | 0 |
| 1831 | 0 |
| 1832 | 0 |
| 1833 | 0 |
| 1834 | 0 |
| 1835 | 0 |
| 1836 | 0 |
| 1837 | 0 |
| 1838 | 0 |
| 1839 | 0 |
| 1840 | 0 |
| 1841 | 0 |
| 1842 | 0 |
| 1843 | 0 |
| 1844 | 0 |
| 1845 | 0 |
| 1846 | 0 |
| 1847 | 0 |
| 1848 | 0 |
| 1849 | 0 |
| 1850 | 0 |
| 1851 | 0 |
| 1852 | 0 |
| 1853 | 0 |
| 1854 | 0 |
| 1855 | 0 |
| 1856 | 0 |
| 1857 | 0 |
| 1858 | 0 |
| 1859 | 0 |
| 1860 | 0 |
| 1861 | 0 |
| 1862 | 0 |
| 1863 | 0 |
| 1864 | 0 |
| 1865 | 0 |
| 1866 | 0 |
| 1867 | 0 |
| 1868 | 0 |
| 1869 | 0 |
| 1870 | 0 |
| 1871 | 0 |
| 1872 | 0 |
| 1873 | 0 |
| 1874 | 0 |
| 1875 | 0 |
| 1876 | 0 |
| 1877 | 0 |
| 1878 | 0 |
| 1879 | 0 |
| 1880 | 0 |
| 1881 | 0 |
| 1882 | 0 |
| 1883 | 0 |
| 1884 | 0 |
| 1885 | 0 |
| 1886 | 0 |
| 1887 | 0 |
| 1888 | 0 |
| 1889 | 0 |
| 1890 | 0 |
| 1891 | 0 |
| 1892 | 0 |
| 1893 | 0 |
| 1894 | 0 |
| 1895 | 0 |
| 1896 | 0 |
| 1897 | 0 |
| 1898 | 0 |
| 1899 | 0 |
| 1900 | 0 |
| 1901 | 0 |
| 1902 | 0 |
| 1903 | 0 |
| 1904 | 0 |
| 1905 | 0 |
| 1906 | 0 |
| 1907 | 0 |
| 1908 | 0 |
| 1909 | 0 |
| 1910 | 0 |
| 1911 | 0 |
| 1912 | 0 |
| 1913 | 0 |
| 1914 | 0 |
| 1915 | 0 |
| 1916 | 0 |
| 1917 | 0 |
| 1918 | 0 |
| 1919 | 0 |
| 1920 | 0 |
| 1921 | 0 |
| 1922 | 0 |
| 1923 | 0 |
| 1924 | 0 |
| 1925 | 0 |
| 1926 | 0 |
| 1927 | 0 |
| 1928 | 0 |
| 1929 | 0 |
| 1930 | 0 |
| 1931 | 0 |
| 1932 | 0 |
| 1933 | 0 |
| 1934 | 0 |
| 1935 | 0 |
| 1936 | 0 |
| 1937 | 0 |
| 1938 | 0 |
| 1939 | 0 |
| 1940 | 0 |
| 1941 | 0 |
| 1942 | 0 |
| 1943 | 0 |
| 1944 | 0 |
| 1945 | 0 |
| 1946 | 0 |
| 1947 | 0 |
| 1948 | 0 |
| 1949 | 0 |
| 1950 | 0 |
| 1951 | 0 |
| 1952 | 0 |
| 1953 | 0 |
| 1954 | 0 |
| 1955 | 0 |
| 1956 | 0 |
| 1957 | 0 |
| 1958 | 0 |
| 1959 | 0 |
| 1960 | 0 |
| 1961 | 0 |
| 1962 | 0 |
| 1963 | 0 |
| 1964 | 0 |
| 1965 | 0 |
| 1966 | 0 |
| 1967 | 0 |
| 1968 | 0 |
| 1969 | 0 |
| 1970 | 0 |
| 1971 | 0 |
| 1972 | 0 |
| 1973 | 0 |
| 1974 | 0 |
| 1975 | 0 |
| 1976 | 0 |
| 1977 | 0 |
| 1978 | 0 |
| 1979 | 0 |
| 1980 | 0 |
| 1981 | 0 |
| 1982 | 0 |
| 1983 | 0 |
| 1984 | 0 |
| 1985 | 0 |
| 1986 | 0 |
| 1987 | 0 |
| 1988 | 0 |
| 1989 | 0 |
| 1990 | 0 |
| 1991 | 0 |
| 1992 | 0 |
| 1993 | 0 |
| 1994 | 0 |
| 1995 | 0 |
| 1996 | 0 |
| 1997 | 0 |
| 1998 | 0 |
| 1999 | 0 |
| 2000 | 0 |
| 2001 | 0 |